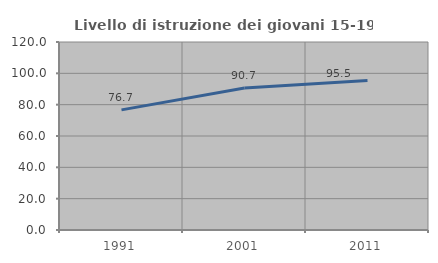
| Category | Livello di istruzione dei giovani 15-19 anni |
|---|---|
| 1991.0 | 76.677 |
| 2001.0 | 90.677 |
| 2011.0 | 95.492 |